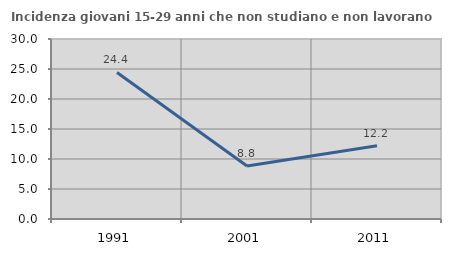
| Category | Incidenza giovani 15-29 anni che non studiano e non lavorano  |
|---|---|
| 1991.0 | 24.432 |
| 2001.0 | 8.84 |
| 2011.0 | 12.224 |